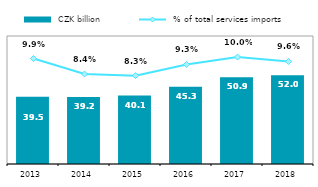
| Category |  CZK billion |
|---|---|
| 2013.0 | 39.458 |
| 2014.0 | 39.242 |
| 2015.0 | 40.08 |
| 2016.0 | 45.268 |
| 2017.0 | 50.899 |
| 2018.0 | 51.975 |